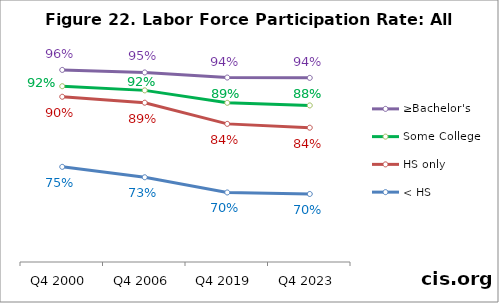
| Category | ≥Bachelor's | Some College | HS only | < HS |
|---|---|---|---|---|
| Q4 2000 | 0.96 | 0.925 | 0.902 | 0.753 |
| Q4 2006 | 0.954 | 0.916 | 0.89 | 0.731 |
| Q4 2019 | 0.943 | 0.889 | 0.845 | 0.698 |
| Q4 2023 | 0.943 | 0.884 | 0.836 | 0.695 |